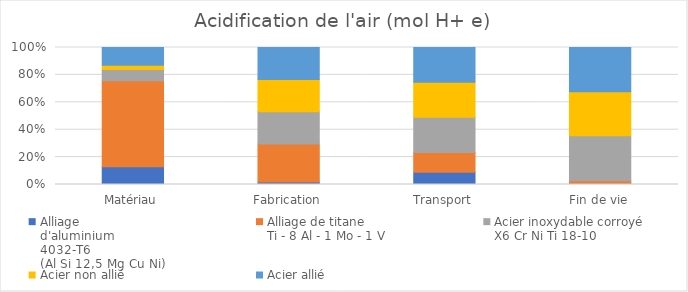
| Category | Alliage
d'aluminium
4032-T6
(Al Si 12,5 Mg Cu Ni) | Alliage de titane
Ti - 8 Al - 1 Mo - 1 V | Acier inoxydable corroyé
X6 Cr Ni Ti 18-10 | Acier non allié
C 60 | Acier allié
14 Ni Cr Mo 13-4 |
|---|---|---|---|---|---|
| Matériau | 1.2 | 5.8 | 0.768 | 0.283 | 1.2 |
| Fabrication | 0.036 | 0.537 | 0.461 | 0.455 | 0.455 |
| Transport | 0.021 | 0.034 | 0.061 | 0.06 | 0.06 |
| Fin de vie | 0.006 | 0.012 | 0.207 | 0.204 | 0.204 |